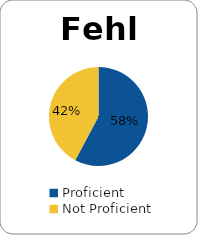
| Category | Series 0 |
|---|---|
| Proficient | 0.578 |
| Not Proficient | 0.422 |